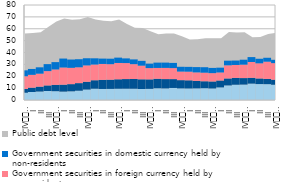
| Category | Government securities in domestic currency held by residents | Government securities in foreign currency held by residents | Government securities in foreign currency held by non-residents | Government securities in domestic currency held by non-residents |
|---|---|---|---|---|
| IV
2013 | 6.108 | 3.154 | 10.712 | 5.01 |
| I | 6.719 | 3.693 | 10.776 | 4.96 |
| II | 7.128 | 4.129 | 10.913 | 5.36 |
| III | 7.559 | 4.715 | 12.058 | 5.877 |
| IV
2014 | 7.422 | 5.345 | 12.945 | 6.191 |
| I | 7.069 | 5.855 | 14.433 | 7.541 |
| II | 7.328 | 6.035 | 13.726 | 6.992 |
| III | 7.819 | 6.391 | 13.333 | 6.8 |
| IV
2015 | 8.813 | 6.56 | 13.751 | 6.029 |
| I | 9.511 | 7.127 | 13.211 | 5.253 |
| II | 9.292 | 7.686 | 13.38 | 4.509 |
| III | 9.354 | 7.767 | 13.041 | 4.621 |
| IV
2016 | 9.483 | 7.966 | 13.733 | 4.499 |
| I | 9.512 | 8.122 | 13.469 | 3.935 |
| II | 9.488 | 8.175 | 12.513 | 4.012 |
| III | 9.278 | 8.153 | 11.475 | 4.063 |
| IV
2017 | 9.384 | 7.996 | 9.495 | 3.758 |
| I | 9.889 | 8.004 | 9.093 | 4.489 |
| II | 9.762 | 7.852 | 9.409 | 4.46 |
| III | 10.139 | 7.457 | 9.259 | 4.379 |
| IV
2018 | 9.786 | 6.935 | 7.211 | 4.041 |
| I | 9.705 | 6.877 | 7.264 | 4.052 |
| II | 9.792 | 6.269 | 7.184 | 4.47 |
| III | 9.928 | 5.861 | 7.205 | 4.618 |
| IV
2019 | 9.715 | 5.901 | 7.005 | 4.4 |
| I | 10.62 | 5.81 | 6.751 | 4.045 |
| II | 12.276 | 5.879 | 11.043 | 3.914 |
| III | 12.859 | 5.771 | 10.868 | 3.727 |
| IV
2020 | 12.985 | 5.475 | 11.295 | 4.17 |
| I | 13.799 | 4.902 | 13.307 | 4.13 |
| II | 13.423 | 4.727 | 12.729 | 3.852 |
| III | 13.345 | 4.404 | 14.504 | 3.316 |
| IV
2021 | 12.849 | 4.268 | 13.919 | 2.813 |